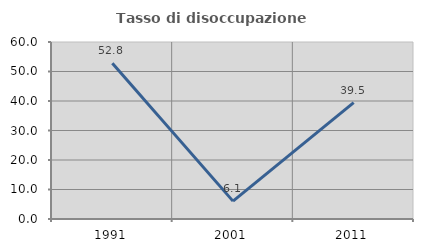
| Category | Tasso di disoccupazione giovanile  |
|---|---|
| 1991.0 | 52.778 |
| 2001.0 | 6.061 |
| 2011.0 | 39.474 |